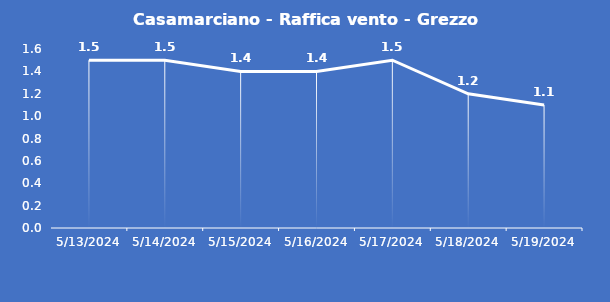
| Category | Casamarciano - Raffica vento - Grezzo (m/s) |
|---|---|
| 5/13/24 | 1.5 |
| 5/14/24 | 1.5 |
| 5/15/24 | 1.4 |
| 5/16/24 | 1.4 |
| 5/17/24 | 1.5 |
| 5/18/24 | 1.2 |
| 5/19/24 | 1.1 |